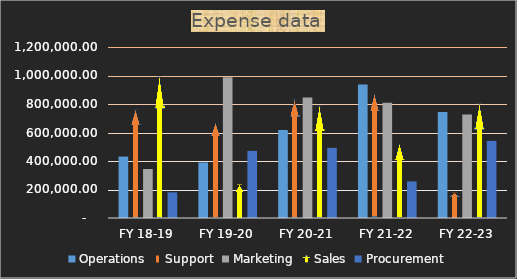
| Category | Operations | Support | Marketing | Sales | Procurement |
|---|---|---|---|---|---|
| FY 18-19 | 431000 | 760000 | 344000 | 992000 | 180000 |
| FY 19-20 | 390000 | 665000 | 987000 | 235000 | 471000 |
| FY 20-21 | 618000 | 829000 | 845000 | 787000 | 492000 |
| FY 21-22 | 937000 | 870000 | 809000 | 518000 | 257000 |
| FY 22-23 | 743000 | 177000 | 727000 | 802000 | 541000 |